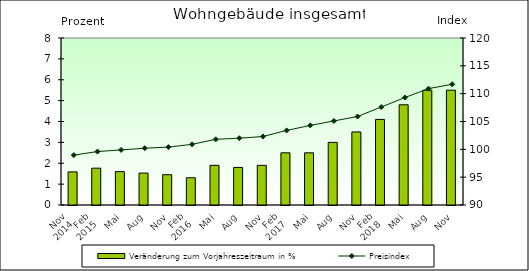
| Category | Veränderung zum Vorjahreszeitraum in % |
|---|---|
| 0 | 1.586 |
| 1 | 1.764 |
| 2 | 1.599 |
| 3 | 1.529 |
| 4 | 1.451 |
| 5 | 1.305 |
| 6 | 1.902 |
| 7 | 1.8 |
| 8 | 1.9 |
| 9 | 2.5 |
| 10 | 2.5 |
| 11 | 3 |
| 12 | 3.5 |
| 13 | 4.1 |
| 14 | 4.8 |
| 15 | 5.5 |
| 16 | 5.5 |